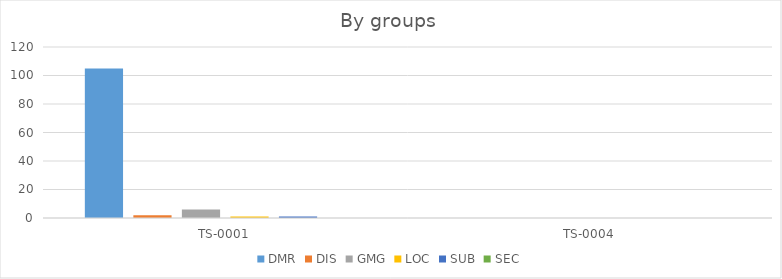
| Category | DMR | DIS | GMG | LOC | SUB | SEC |
|---|---|---|---|---|---|---|
| TS-0001 | 105 | 2 | 6 | 1 | 1 | 0 |
| TS-0004 | 0 | 0 | 0 | 0 | 0 | 0 |